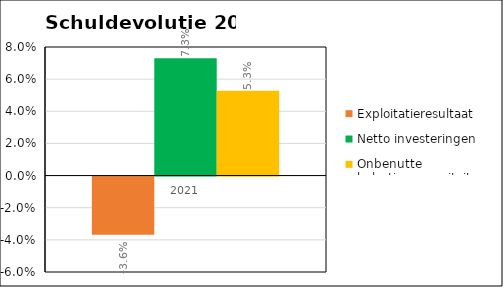
| Category | Exploitatieresultaat | Netto investeringen | Onbenutte belastingcapaciteit |
|---|---|---|---|
| 0 | -0.036 | 0.073 | 0.053 |